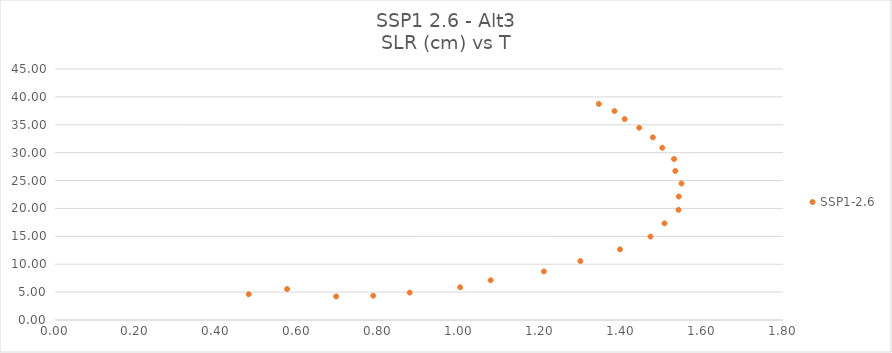
| Category | SSP1-2.6 |
|---|---|
| 0.573801925 | 5.549 |
| 0.479031654 | 4.625 |
| 0.695197934 | 4.219 |
| 0.786748548 | 4.353 |
| 0.877021499 | 4.915 |
| 1.001823785 | 5.869 |
| 1.077169017 | 7.122 |
| 1.208724293 | 8.712 |
| 1.298932985 | 10.562 |
| 1.396905844 | 12.663 |
| 1.472273274 | 14.952 |
| 1.507020793 | 17.323 |
| 1.541614368 | 19.749 |
| 1.54230726 | 22.135 |
| 1.548946226 | 24.478 |
| 1.533739185 | 26.716 |
| 1.530539679 | 28.87 |
| 1.50137874 | 30.876 |
| 1.478128026 | 32.748 |
| 1.444398291 | 34.464 |
| 1.408608152 | 36.022 |
| 1.383290225 | 37.453 |
| 1.344670705 | 38.731 |